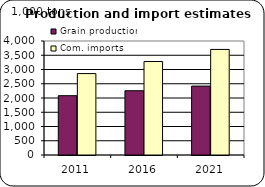
| Category | Grain production | Com. imports |
|---|---|---|
| 2011.0 | 2081.596 | 2856.771 |
| 2016.0 | 2255.153 | 3279.882 |
| 2021.0 | 2417.411 | 3704.224 |